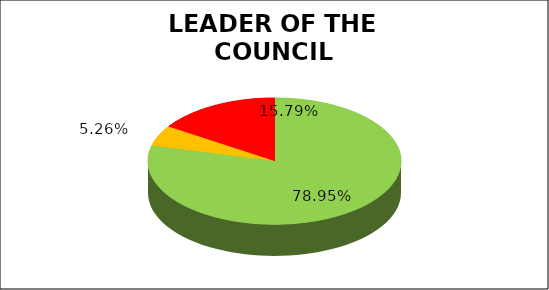
| Category | Q4 |
|---|---|
| Green | 0.789 |
| Amber | 0.053 |
| Red | 0.158 |